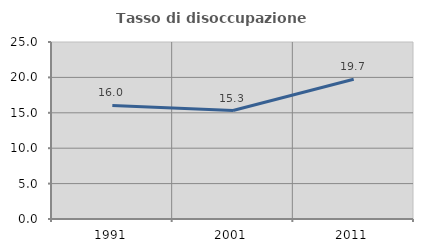
| Category | Tasso di disoccupazione giovanile  |
|---|---|
| 1991.0 | 16.043 |
| 2001.0 | 15.315 |
| 2011.0 | 19.737 |